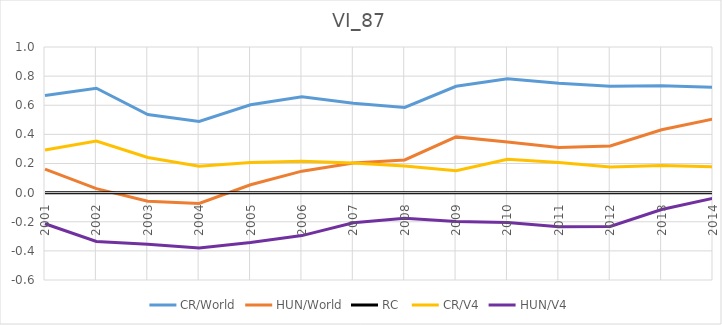
| Category | CR/World | HUN/World | RC  | CR/V4 | HUN/V4 |
|---|---|---|---|---|---|
| 2001.0 | 0.668 | 0.162 | 0 | 0.292 | -0.214 |
| 2002.0 | 0.717 | 0.027 | 0 | 0.354 | -0.336 |
| 2003.0 | 0.536 | -0.059 | 0 | 0.241 | -0.354 |
| 2004.0 | 0.488 | -0.074 | 0 | 0.182 | -0.38 |
| 2005.0 | 0.604 | 0.054 | 0 | 0.207 | -0.342 |
| 2006.0 | 0.658 | 0.147 | 0 | 0.216 | -0.295 |
| 2007.0 | 0.613 | 0.204 | 0 | 0.203 | -0.207 |
| 2008.0 | 0.585 | 0.224 | 0 | 0.184 | -0.177 |
| 2009.0 | 0.731 | 0.383 | 0 | 0.15 | -0.198 |
| 2010.0 | 0.783 | 0.348 | 0 | 0.23 | -0.205 |
| 2011.0 | 0.752 | 0.311 | 0 | 0.207 | -0.234 |
| 2012.0 | 0.73 | 0.321 | 0 | 0.177 | -0.233 |
| 2013.0 | 0.734 | 0.432 | 0 | 0.186 | -0.116 |
| 2014.0 | 0.723 | 0.506 | 0 | 0.178 | -0.039 |